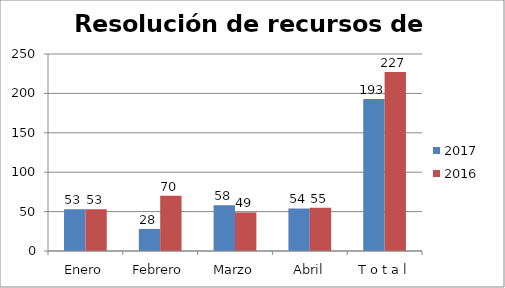
| Category | 2017 | 2016 |
|---|---|---|
| Enero | 53 | 53 |
| Febrero | 28 | 70 |
| Marzo | 58 | 49 |
| Abril | 54 | 55 |
| T o t a l | 193 | 227 |